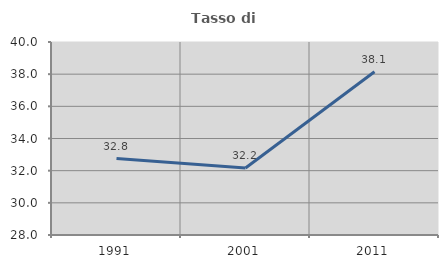
| Category | Tasso di occupazione   |
|---|---|
| 1991.0 | 32.751 |
| 2001.0 | 32.166 |
| 2011.0 | 38.15 |